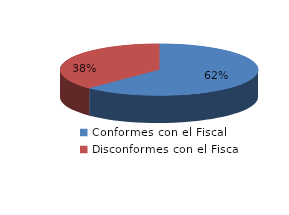
| Category | Series 0 |
|---|---|
| 0 | 1302 |
| 1 | 786 |